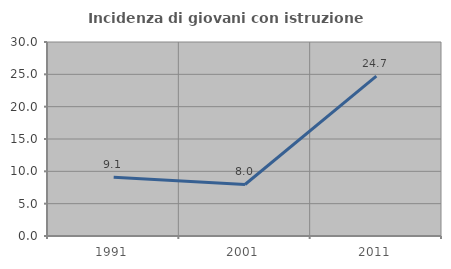
| Category | Incidenza di giovani con istruzione universitaria |
|---|---|
| 1991.0 | 9.091 |
| 2001.0 | 7.965 |
| 2011.0 | 24.737 |